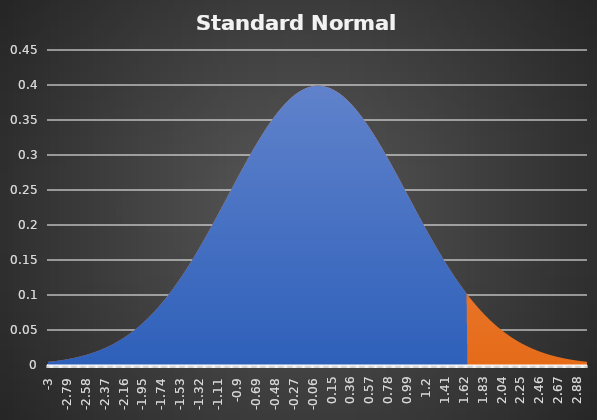
| Category | Z-Value | Area |
|---|---|---|
| -3.0 | 0.004 | 0.004 |
| -2.99 | 0.005 | 0.005 |
| -2.9800000000000004 | 0.005 | 0.005 |
| -2.9700000000000006 | 0.005 | 0.005 |
| -2.960000000000001 | 0.005 | 0.005 |
| -2.950000000000001 | 0.005 | 0.005 |
| -2.9400000000000013 | 0.005 | 0.005 |
| -2.9300000000000015 | 0.005 | 0.005 |
| -2.9200000000000017 | 0.006 | 0.006 |
| -2.910000000000002 | 0.006 | 0.006 |
| -2.900000000000002 | 0.006 | 0.006 |
| -2.8900000000000023 | 0.006 | 0.006 |
| -2.8800000000000026 | 0.006 | 0.006 |
| -2.8700000000000028 | 0.006 | 0.006 |
| -2.860000000000003 | 0.007 | 0.007 |
| -2.850000000000003 | 0.007 | 0.007 |
| -2.8400000000000034 | 0.007 | 0.007 |
| -2.8300000000000036 | 0.007 | 0.007 |
| -2.820000000000004 | 0.007 | 0.007 |
| -2.810000000000004 | 0.008 | 0.008 |
| -2.8000000000000043 | 0.008 | 0.008 |
| -2.7900000000000045 | 0.008 | 0.008 |
| -2.7800000000000047 | 0.008 | 0.008 |
| -2.770000000000005 | 0.009 | 0.009 |
| -2.760000000000005 | 0.009 | 0.009 |
| -2.7500000000000053 | 0.009 | 0.009 |
| -2.7400000000000055 | 0.009 | 0.009 |
| -2.7300000000000058 | 0.01 | 0.01 |
| -2.720000000000006 | 0.01 | 0.01 |
| -2.710000000000006 | 0.01 | 0.01 |
| -2.7000000000000064 | 0.01 | 0.01 |
| -2.6900000000000066 | 0.011 | 0.011 |
| -2.680000000000007 | 0.011 | 0.011 |
| -2.670000000000007 | 0.011 | 0.011 |
| -2.6600000000000072 | 0.012 | 0.012 |
| -2.6500000000000075 | 0.012 | 0.012 |
| -2.6400000000000077 | 0.012 | 0.012 |
| -2.630000000000008 | 0.013 | 0.013 |
| -2.620000000000008 | 0.013 | 0.013 |
| -2.6100000000000083 | 0.013 | 0.013 |
| -2.6000000000000085 | 0.014 | 0.014 |
| -2.5900000000000087 | 0.014 | 0.014 |
| -2.580000000000009 | 0.014 | 0.014 |
| -2.570000000000009 | 0.015 | 0.015 |
| -2.5600000000000094 | 0.015 | 0.015 |
| -2.5500000000000096 | 0.015 | 0.015 |
| -2.54000000000001 | 0.016 | 0.016 |
| -2.53000000000001 | 0.016 | 0.016 |
| -2.5200000000000102 | 0.017 | 0.017 |
| -2.5100000000000104 | 0.017 | 0.017 |
| -2.5000000000000107 | 0.018 | 0.018 |
| -2.490000000000011 | 0.018 | 0.018 |
| -2.480000000000011 | 0.018 | 0.018 |
| -2.4700000000000113 | 0.019 | 0.019 |
| -2.4600000000000115 | 0.019 | 0.019 |
| -2.4500000000000117 | 0.02 | 0.02 |
| -2.440000000000012 | 0.02 | 0.02 |
| -2.430000000000012 | 0.021 | 0.021 |
| -2.4200000000000124 | 0.021 | 0.021 |
| -2.4100000000000126 | 0.022 | 0.022 |
| -2.400000000000013 | 0.022 | 0.022 |
| -2.390000000000013 | 0.023 | 0.023 |
| -2.380000000000013 | 0.023 | 0.023 |
| -2.3700000000000134 | 0.024 | 0.024 |
| -2.3600000000000136 | 0.025 | 0.025 |
| -2.350000000000014 | 0.025 | 0.025 |
| -2.340000000000014 | 0.026 | 0.026 |
| -2.3300000000000143 | 0.026 | 0.026 |
| -2.3200000000000145 | 0.027 | 0.027 |
| -2.3100000000000147 | 0.028 | 0.028 |
| -2.300000000000015 | 0.028 | 0.028 |
| -2.290000000000015 | 0.029 | 0.029 |
| -2.2800000000000153 | 0.03 | 0.03 |
| -2.2700000000000156 | 0.03 | 0.03 |
| -2.2600000000000158 | 0.031 | 0.031 |
| -2.250000000000016 | 0.032 | 0.032 |
| -2.240000000000016 | 0.032 | 0.032 |
| -2.2300000000000164 | 0.033 | 0.033 |
| -2.2200000000000166 | 0.034 | 0.034 |
| -2.210000000000017 | 0.035 | 0.035 |
| -2.200000000000017 | 0.035 | 0.035 |
| -2.1900000000000173 | 0.036 | 0.036 |
| -2.1800000000000175 | 0.037 | 0.037 |
| -2.1700000000000177 | 0.038 | 0.038 |
| -2.160000000000018 | 0.039 | 0.039 |
| -2.150000000000018 | 0.04 | 0.04 |
| -2.1400000000000183 | 0.04 | 0.04 |
| -2.1300000000000185 | 0.041 | 0.041 |
| -2.1200000000000188 | 0.042 | 0.042 |
| -2.110000000000019 | 0.043 | 0.043 |
| -2.100000000000019 | 0.044 | 0.044 |
| -2.0900000000000194 | 0.045 | 0.045 |
| -2.0800000000000196 | 0.046 | 0.046 |
| -2.07000000000002 | 0.047 | 0.047 |
| -2.06000000000002 | 0.048 | 0.048 |
| -2.0500000000000203 | 0.049 | 0.049 |
| -2.0400000000000205 | 0.05 | 0.05 |
| -2.0300000000000207 | 0.051 | 0.051 |
| -2.020000000000021 | 0.052 | 0.052 |
| -2.010000000000021 | 0.053 | 0.053 |
| -2.0000000000000213 | 0.054 | 0.054 |
| -1.9900000000000213 | 0.055 | 0.055 |
| -1.9800000000000213 | 0.056 | 0.056 |
| -1.9700000000000213 | 0.057 | 0.057 |
| -1.9600000000000213 | 0.058 | 0.058 |
| -1.9500000000000213 | 0.06 | 0.06 |
| -1.9400000000000213 | 0.061 | 0.061 |
| -1.9300000000000213 | 0.062 | 0.062 |
| -1.9200000000000212 | 0.063 | 0.063 |
| -1.9100000000000212 | 0.064 | 0.064 |
| -1.9000000000000212 | 0.066 | 0.066 |
| -1.8900000000000212 | 0.067 | 0.067 |
| -1.8800000000000212 | 0.068 | 0.068 |
| -1.8700000000000212 | 0.069 | 0.069 |
| -1.8600000000000212 | 0.071 | 0.071 |
| -1.8500000000000212 | 0.072 | 0.072 |
| -1.8400000000000212 | 0.073 | 0.073 |
| -1.8300000000000212 | 0.075 | 0.075 |
| -1.8200000000000212 | 0.076 | 0.076 |
| -1.8100000000000211 | 0.078 | 0.078 |
| -1.8000000000000211 | 0.079 | 0.079 |
| -1.7900000000000211 | 0.08 | 0.08 |
| -1.7800000000000211 | 0.082 | 0.082 |
| -1.7700000000000211 | 0.083 | 0.083 |
| -1.760000000000021 | 0.085 | 0.085 |
| -1.750000000000021 | 0.086 | 0.086 |
| -1.740000000000021 | 0.088 | 0.088 |
| -1.730000000000021 | 0.089 | 0.089 |
| -1.720000000000021 | 0.091 | 0.091 |
| -1.710000000000021 | 0.092 | 0.092 |
| -1.700000000000021 | 0.094 | 0.094 |
| -1.690000000000021 | 0.096 | 0.096 |
| -1.680000000000021 | 0.097 | 0.097 |
| -1.670000000000021 | 0.099 | 0.099 |
| -1.660000000000021 | 0.101 | 0.101 |
| -1.650000000000021 | 0.102 | 0.102 |
| -1.640000000000021 | 0.104 | 0.104 |
| -1.630000000000021 | 0.106 | 0.106 |
| -1.620000000000021 | 0.107 | 0.107 |
| -1.610000000000021 | 0.109 | 0.109 |
| -1.600000000000021 | 0.111 | 0.111 |
| -1.590000000000021 | 0.113 | 0.113 |
| -1.580000000000021 | 0.115 | 0.115 |
| -1.570000000000021 | 0.116 | 0.116 |
| -1.560000000000021 | 0.118 | 0.118 |
| -1.550000000000021 | 0.12 | 0.12 |
| -1.540000000000021 | 0.122 | 0.122 |
| -1.530000000000021 | 0.124 | 0.124 |
| -1.520000000000021 | 0.126 | 0.126 |
| -1.5100000000000209 | 0.128 | 0.128 |
| -1.5000000000000209 | 0.13 | 0.13 |
| -1.4900000000000209 | 0.131 | 0.131 |
| -1.4800000000000209 | 0.133 | 0.133 |
| -1.4700000000000208 | 0.135 | 0.135 |
| -1.4600000000000208 | 0.137 | 0.137 |
| -1.4500000000000208 | 0.139 | 0.139 |
| -1.4400000000000208 | 0.141 | 0.141 |
| -1.4300000000000208 | 0.144 | 0.144 |
| -1.4200000000000208 | 0.146 | 0.146 |
| -1.4100000000000208 | 0.148 | 0.148 |
| -1.4000000000000208 | 0.15 | 0.15 |
| -1.3900000000000208 | 0.152 | 0.152 |
| -1.3800000000000208 | 0.154 | 0.154 |
| -1.3700000000000208 | 0.156 | 0.156 |
| -1.3600000000000207 | 0.158 | 0.158 |
| -1.3500000000000207 | 0.16 | 0.16 |
| -1.3400000000000207 | 0.163 | 0.163 |
| -1.3300000000000207 | 0.165 | 0.165 |
| -1.3200000000000207 | 0.167 | 0.167 |
| -1.3100000000000207 | 0.169 | 0.169 |
| -1.3000000000000207 | 0.171 | 0.171 |
| -1.2900000000000207 | 0.174 | 0.174 |
| -1.2800000000000207 | 0.176 | 0.176 |
| -1.2700000000000207 | 0.178 | 0.178 |
| -1.2600000000000207 | 0.18 | 0.18 |
| -1.2500000000000207 | 0.183 | 0.183 |
| -1.2400000000000206 | 0.185 | 0.185 |
| -1.2300000000000206 | 0.187 | 0.187 |
| -1.2200000000000206 | 0.19 | 0.19 |
| -1.2100000000000206 | 0.192 | 0.192 |
| -1.2000000000000206 | 0.194 | 0.194 |
| -1.1900000000000206 | 0.197 | 0.197 |
| -1.1800000000000206 | 0.199 | 0.199 |
| -1.1700000000000206 | 0.201 | 0.201 |
| -1.1600000000000206 | 0.204 | 0.204 |
| -1.1500000000000206 | 0.206 | 0.206 |
| -1.1400000000000206 | 0.208 | 0.208 |
| -1.1300000000000205 | 0.211 | 0.211 |
| -1.1200000000000205 | 0.213 | 0.213 |
| -1.1100000000000205 | 0.215 | 0.215 |
| -1.1000000000000205 | 0.218 | 0.218 |
| -1.0900000000000205 | 0.22 | 0.22 |
| -1.0800000000000205 | 0.223 | 0.223 |
| -1.0700000000000205 | 0.225 | 0.225 |
| -1.0600000000000205 | 0.227 | 0.227 |
| -1.0500000000000205 | 0.23 | 0.23 |
| -1.0400000000000205 | 0.232 | 0.232 |
| -1.0300000000000205 | 0.235 | 0.235 |
| -1.0200000000000204 | 0.237 | 0.237 |
| -1.0100000000000204 | 0.24 | 0.24 |
| -1.0000000000000204 | 0.242 | 0.242 |
| -0.9900000000000204 | 0.244 | 0.244 |
| -0.9800000000000204 | 0.247 | 0.247 |
| -0.9700000000000204 | 0.249 | 0.249 |
| -0.9600000000000204 | 0.252 | 0.252 |
| -0.9500000000000204 | 0.254 | 0.254 |
| -0.9400000000000204 | 0.256 | 0.256 |
| -0.9300000000000204 | 0.259 | 0.259 |
| -0.9200000000000204 | 0.261 | 0.261 |
| -0.9100000000000203 | 0.264 | 0.264 |
| -0.9000000000000203 | 0.266 | 0.266 |
| -0.8900000000000203 | 0.268 | 0.268 |
| -0.8800000000000203 | 0.271 | 0.271 |
| -0.8700000000000203 | 0.273 | 0.273 |
| -0.8600000000000203 | 0.276 | 0.276 |
| -0.8500000000000203 | 0.278 | 0.278 |
| -0.8400000000000203 | 0.28 | 0.28 |
| -0.8300000000000203 | 0.283 | 0.283 |
| -0.8200000000000203 | 0.285 | 0.285 |
| -0.8100000000000203 | 0.287 | 0.287 |
| -0.8000000000000203 | 0.29 | 0.29 |
| -0.7900000000000202 | 0.292 | 0.292 |
| -0.7800000000000202 | 0.294 | 0.294 |
| -0.7700000000000202 | 0.297 | 0.297 |
| -0.7600000000000202 | 0.299 | 0.299 |
| -0.7500000000000202 | 0.301 | 0.301 |
| -0.7400000000000202 | 0.303 | 0.303 |
| -0.7300000000000202 | 0.306 | 0.306 |
| -0.7200000000000202 | 0.308 | 0.308 |
| -0.7100000000000202 | 0.31 | 0.31 |
| -0.7000000000000202 | 0.312 | 0.312 |
| -0.6900000000000202 | 0.314 | 0.314 |
| -0.6800000000000201 | 0.317 | 0.317 |
| -0.6700000000000201 | 0.319 | 0.319 |
| -0.6600000000000201 | 0.321 | 0.321 |
| -0.6500000000000201 | 0.323 | 0.323 |
| -0.6400000000000201 | 0.325 | 0.325 |
| -0.6300000000000201 | 0.327 | 0.327 |
| -0.6200000000000201 | 0.329 | 0.329 |
| -0.6100000000000201 | 0.331 | 0.331 |
| -0.6000000000000201 | 0.333 | 0.333 |
| -0.5900000000000201 | 0.335 | 0.335 |
| -0.58000000000002 | 0.337 | 0.337 |
| -0.57000000000002 | 0.339 | 0.339 |
| -0.56000000000002 | 0.341 | 0.341 |
| -0.55000000000002 | 0.343 | 0.343 |
| -0.54000000000002 | 0.345 | 0.345 |
| -0.53000000000002 | 0.347 | 0.347 |
| -0.52000000000002 | 0.348 | 0.348 |
| -0.51000000000002 | 0.35 | 0.35 |
| -0.50000000000002 | 0.352 | 0.352 |
| -0.49000000000002 | 0.354 | 0.354 |
| -0.48000000000001997 | 0.356 | 0.356 |
| -0.47000000000001996 | 0.357 | 0.357 |
| -0.46000000000001995 | 0.359 | 0.359 |
| -0.45000000000001994 | 0.361 | 0.361 |
| -0.44000000000001993 | 0.362 | 0.362 |
| -0.4300000000000199 | 0.364 | 0.364 |
| -0.4200000000000199 | 0.365 | 0.365 |
| -0.4100000000000199 | 0.367 | 0.367 |
| -0.4000000000000199 | 0.368 | 0.368 |
| -0.3900000000000199 | 0.37 | 0.37 |
| -0.3800000000000199 | 0.371 | 0.371 |
| -0.37000000000001987 | 0.373 | 0.373 |
| -0.36000000000001986 | 0.374 | 0.374 |
| -0.35000000000001985 | 0.375 | 0.375 |
| -0.34000000000001984 | 0.377 | 0.377 |
| -0.33000000000001983 | 0.378 | 0.378 |
| -0.3200000000000198 | 0.379 | 0.379 |
| -0.3100000000000198 | 0.38 | 0.38 |
| -0.3000000000000198 | 0.381 | 0.381 |
| -0.2900000000000198 | 0.383 | 0.383 |
| -0.2800000000000198 | 0.384 | 0.384 |
| -0.2700000000000198 | 0.385 | 0.385 |
| -0.26000000000001977 | 0.386 | 0.386 |
| -0.25000000000001976 | 0.387 | 0.387 |
| -0.24000000000001975 | 0.388 | 0.388 |
| -0.23000000000001974 | 0.389 | 0.389 |
| -0.22000000000001974 | 0.389 | 0.389 |
| -0.21000000000001973 | 0.39 | 0.39 |
| -0.20000000000001972 | 0.391 | 0.391 |
| -0.1900000000000197 | 0.392 | 0.392 |
| -0.1800000000000197 | 0.393 | 0.393 |
| -0.1700000000000197 | 0.393 | 0.393 |
| -0.16000000000001968 | 0.394 | 0.394 |
| -0.15000000000001967 | 0.394 | 0.394 |
| -0.14000000000001966 | 0.395 | 0.395 |
| -0.13000000000001966 | 0.396 | 0.396 |
| -0.12000000000001966 | 0.396 | 0.396 |
| -0.11000000000001967 | 0.397 | 0.397 |
| -0.10000000000001967 | 0.397 | 0.397 |
| -0.09000000000001968 | 0.397 | 0.397 |
| -0.08000000000001968 | 0.398 | 0.398 |
| -0.07000000000001969 | 0.398 | 0.398 |
| -0.06000000000001968 | 0.398 | 0.398 |
| -0.05000000000001968 | 0.398 | 0.398 |
| -0.04000000000001968 | 0.399 | 0.399 |
| -0.030000000000019678 | 0.399 | 0.399 |
| -0.020000000000019676 | 0.399 | 0.399 |
| -0.010000000000019675 | 0.399 | 0.399 |
| 0.0 | 0.399 | 0.399 |
| 0.01 | 0.399 | 0.399 |
| 0.02 | 0.399 | 0.399 |
| 0.03 | 0.399 | 0.399 |
| 0.04 | 0.399 | 0.399 |
| 0.05 | 0.398 | 0.398 |
| 0.060000000000000005 | 0.398 | 0.398 |
| 0.07 | 0.398 | 0.398 |
| 0.08 | 0.398 | 0.398 |
| 0.09 | 0.397 | 0.397 |
| 0.09999999999999999 | 0.397 | 0.397 |
| 0.10999999999999999 | 0.397 | 0.397 |
| 0.11999999999999998 | 0.396 | 0.396 |
| 0.12999999999999998 | 0.396 | 0.396 |
| 0.13999999999999999 | 0.395 | 0.395 |
| 0.15 | 0.394 | 0.394 |
| 0.16 | 0.394 | 0.394 |
| 0.17 | 0.393 | 0.393 |
| 0.18000000000000002 | 0.393 | 0.393 |
| 0.19000000000000003 | 0.392 | 0.392 |
| 0.20000000000000004 | 0.391 | 0.391 |
| 0.21000000000000005 | 0.39 | 0.39 |
| 0.22000000000000006 | 0.389 | 0.389 |
| 0.23000000000000007 | 0.389 | 0.389 |
| 0.24000000000000007 | 0.388 | 0.388 |
| 0.25000000000000006 | 0.387 | 0.387 |
| 0.26000000000000006 | 0.386 | 0.386 |
| 0.2700000000000001 | 0.385 | 0.385 |
| 0.2800000000000001 | 0.384 | 0.384 |
| 0.2900000000000001 | 0.383 | 0.383 |
| 0.3000000000000001 | 0.381 | 0.381 |
| 0.3100000000000001 | 0.38 | 0.38 |
| 0.3200000000000001 | 0.379 | 0.379 |
| 0.3300000000000001 | 0.378 | 0.378 |
| 0.34000000000000014 | 0.377 | 0.377 |
| 0.35000000000000014 | 0.375 | 0.375 |
| 0.36000000000000015 | 0.374 | 0.374 |
| 0.37000000000000016 | 0.373 | 0.373 |
| 0.38000000000000017 | 0.371 | 0.371 |
| 0.3900000000000002 | 0.37 | 0.37 |
| 0.4000000000000002 | 0.368 | 0.368 |
| 0.4100000000000002 | 0.367 | 0.367 |
| 0.4200000000000002 | 0.365 | 0.365 |
| 0.4300000000000002 | 0.364 | 0.364 |
| 0.4400000000000002 | 0.362 | 0.362 |
| 0.45000000000000023 | 0.361 | 0.361 |
| 0.46000000000000024 | 0.359 | 0.359 |
| 0.47000000000000025 | 0.357 | 0.357 |
| 0.48000000000000026 | 0.356 | 0.356 |
| 0.49000000000000027 | 0.354 | 0.354 |
| 0.5000000000000002 | 0.352 | 0.352 |
| 0.5100000000000002 | 0.35 | 0.35 |
| 0.5200000000000002 | 0.348 | 0.348 |
| 0.5300000000000002 | 0.347 | 0.347 |
| 0.5400000000000003 | 0.345 | 0.345 |
| 0.5500000000000003 | 0.343 | 0.343 |
| 0.5600000000000003 | 0.341 | 0.341 |
| 0.5700000000000003 | 0.339 | 0.339 |
| 0.5800000000000003 | 0.337 | 0.337 |
| 0.5900000000000003 | 0.335 | 0.335 |
| 0.6000000000000003 | 0.333 | 0.333 |
| 0.6100000000000003 | 0.331 | 0.331 |
| 0.6200000000000003 | 0.329 | 0.329 |
| 0.6300000000000003 | 0.327 | 0.327 |
| 0.6400000000000003 | 0.325 | 0.325 |
| 0.6500000000000004 | 0.323 | 0.323 |
| 0.6600000000000004 | 0.321 | 0.321 |
| 0.6700000000000004 | 0.319 | 0.319 |
| 0.6800000000000004 | 0.317 | 0.317 |
| 0.6900000000000004 | 0.314 | 0.314 |
| 0.7000000000000004 | 0.312 | 0.312 |
| 0.7100000000000004 | 0.31 | 0.31 |
| 0.7200000000000004 | 0.308 | 0.308 |
| 0.7300000000000004 | 0.306 | 0.306 |
| 0.7400000000000004 | 0.303 | 0.303 |
| 0.7500000000000004 | 0.301 | 0.301 |
| 0.7600000000000005 | 0.299 | 0.299 |
| 0.7700000000000005 | 0.297 | 0.297 |
| 0.7800000000000005 | 0.294 | 0.294 |
| 0.7900000000000005 | 0.292 | 0.292 |
| 0.8000000000000005 | 0.29 | 0.29 |
| 0.8100000000000005 | 0.287 | 0.287 |
| 0.8200000000000005 | 0.285 | 0.285 |
| 0.8300000000000005 | 0.283 | 0.283 |
| 0.8400000000000005 | 0.28 | 0.28 |
| 0.8500000000000005 | 0.278 | 0.278 |
| 0.8600000000000005 | 0.276 | 0.276 |
| 0.8700000000000006 | 0.273 | 0.273 |
| 0.8800000000000006 | 0.271 | 0.271 |
| 0.8900000000000006 | 0.268 | 0.268 |
| 0.9000000000000006 | 0.266 | 0.266 |
| 0.9100000000000006 | 0.264 | 0.264 |
| 0.9200000000000006 | 0.261 | 0.261 |
| 0.9300000000000006 | 0.259 | 0.259 |
| 0.9400000000000006 | 0.256 | 0.256 |
| 0.9500000000000006 | 0.254 | 0.254 |
| 0.9600000000000006 | 0.252 | 0.252 |
| 0.9700000000000006 | 0.249 | 0.249 |
| 0.9800000000000006 | 0.247 | 0.247 |
| 0.9900000000000007 | 0.244 | 0.244 |
| 1.0000000000000007 | 0.242 | 0.242 |
| 1.0100000000000007 | 0.24 | 0.24 |
| 1.0200000000000007 | 0.237 | 0.237 |
| 1.0300000000000007 | 0.235 | 0.235 |
| 1.0400000000000007 | 0.232 | 0.232 |
| 1.0500000000000007 | 0.23 | 0.23 |
| 1.0600000000000007 | 0.227 | 0.227 |
| 1.0700000000000007 | 0.225 | 0.225 |
| 1.0800000000000007 | 0.223 | 0.223 |
| 1.0900000000000007 | 0.22 | 0.22 |
| 1.1000000000000008 | 0.218 | 0.218 |
| 1.1100000000000008 | 0.215 | 0.215 |
| 1.1200000000000008 | 0.213 | 0.213 |
| 1.1300000000000008 | 0.211 | 0.211 |
| 1.1400000000000008 | 0.208 | 0.208 |
| 1.1500000000000008 | 0.206 | 0.206 |
| 1.1600000000000008 | 0.204 | 0.204 |
| 1.1700000000000008 | 0.201 | 0.201 |
| 1.1800000000000008 | 0.199 | 0.199 |
| 1.1900000000000008 | 0.197 | 0.197 |
| 1.2000000000000008 | 0.194 | 0.194 |
| 1.2100000000000009 | 0.192 | 0.192 |
| 1.2200000000000009 | 0.19 | 0.19 |
| 1.2300000000000009 | 0.187 | 0.187 |
| 1.2400000000000009 | 0.185 | 0.185 |
| 1.2500000000000009 | 0.183 | 0.183 |
| 1.260000000000001 | 0.18 | 0.18 |
| 1.270000000000001 | 0.178 | 0.178 |
| 1.280000000000001 | 0.176 | 0.176 |
| 1.290000000000001 | 0.174 | 0.174 |
| 1.300000000000001 | 0.171 | 0.171 |
| 1.310000000000001 | 0.169 | 0.169 |
| 1.320000000000001 | 0.167 | 0.167 |
| 1.330000000000001 | 0.165 | 0.165 |
| 1.340000000000001 | 0.163 | 0.163 |
| 1.350000000000001 | 0.16 | 0.16 |
| 1.360000000000001 | 0.158 | 0.158 |
| 1.370000000000001 | 0.156 | 0.156 |
| 1.380000000000001 | 0.154 | 0.154 |
| 1.390000000000001 | 0.152 | 0.152 |
| 1.400000000000001 | 0.15 | 0.15 |
| 1.410000000000001 | 0.148 | 0.148 |
| 1.420000000000001 | 0.146 | 0.146 |
| 1.430000000000001 | 0.144 | 0.144 |
| 1.440000000000001 | 0.141 | 0.141 |
| 1.450000000000001 | 0.139 | 0.139 |
| 1.460000000000001 | 0.137 | 0.137 |
| 1.470000000000001 | 0.135 | 0.135 |
| 1.480000000000001 | 0.133 | 0.133 |
| 1.490000000000001 | 0.131 | 0.131 |
| 1.500000000000001 | 0.13 | 0.13 |
| 1.5100000000000011 | 0.128 | 0.128 |
| 1.5200000000000011 | 0.126 | 0.126 |
| 1.5300000000000011 | 0.124 | 0.124 |
| 1.5400000000000011 | 0.122 | 0.122 |
| 1.5500000000000012 | 0.12 | 0.12 |
| 1.5600000000000012 | 0.118 | 0.118 |
| 1.5700000000000012 | 0.116 | 0.116 |
| 1.5800000000000012 | 0.115 | 0.115 |
| 1.5900000000000012 | 0.113 | 0.113 |
| 1.6000000000000012 | 0.111 | 0.111 |
| 1.6100000000000012 | 0.109 | 0.109 |
| 1.6200000000000012 | 0.107 | 0.107 |
| 1.6300000000000012 | 0.106 | 0.106 |
| 1.6400000000000012 | 0.104 | 0.104 |
| 1.6500000000000012 | 0.102 | 0.102 |
| 1.6600000000000013 | 0.101 | 0 |
| 1.6700000000000013 | 0.099 | 0 |
| 1.6800000000000013 | 0.097 | 0 |
| 1.6900000000000013 | 0.096 | 0 |
| 1.7000000000000013 | 0.094 | 0 |
| 1.7100000000000013 | 0.092 | 0 |
| 1.7200000000000013 | 0.091 | 0 |
| 1.7300000000000013 | 0.089 | 0 |
| 1.7400000000000013 | 0.088 | 0 |
| 1.7500000000000013 | 0.086 | 0 |
| 1.7600000000000013 | 0.085 | 0 |
| 1.7700000000000014 | 0.083 | 0 |
| 1.7800000000000014 | 0.082 | 0 |
| 1.7900000000000014 | 0.08 | 0 |
| 1.8000000000000014 | 0.079 | 0 |
| 1.8100000000000014 | 0.078 | 0 |
| 1.8200000000000014 | 0.076 | 0 |
| 1.8300000000000014 | 0.075 | 0 |
| 1.8400000000000014 | 0.073 | 0 |
| 1.8500000000000014 | 0.072 | 0 |
| 1.8600000000000014 | 0.071 | 0 |
| 1.8700000000000014 | 0.069 | 0 |
| 1.8800000000000014 | 0.068 | 0 |
| 1.8900000000000015 | 0.067 | 0 |
| 1.9000000000000015 | 0.066 | 0 |
| 1.9100000000000015 | 0.064 | 0 |
| 1.9200000000000015 | 0.063 | 0 |
| 1.9300000000000015 | 0.062 | 0 |
| 1.9400000000000015 | 0.061 | 0 |
| 1.9500000000000015 | 0.06 | 0 |
| 1.9600000000000015 | 0.058 | 0 |
| 1.9700000000000015 | 0.057 | 0 |
| 1.9800000000000015 | 0.056 | 0 |
| 1.9900000000000015 | 0.055 | 0 |
| 2.0000000000000013 | 0.054 | 0 |
| 2.010000000000001 | 0.053 | 0 |
| 2.020000000000001 | 0.052 | 0 |
| 2.0300000000000007 | 0.051 | 0 |
| 2.0400000000000005 | 0.05 | 0 |
| 2.0500000000000003 | 0.049 | 0 |
| 2.06 | 0.048 | 0 |
| 2.07 | 0.047 | 0 |
| 2.0799999999999996 | 0.046 | 0 |
| 2.0899999999999994 | 0.045 | 0 |
| 2.099999999999999 | 0.044 | 0 |
| 2.109999999999999 | 0.043 | 0 |
| 2.1199999999999988 | 0.042 | 0 |
| 2.1299999999999986 | 0.041 | 0 |
| 2.1399999999999983 | 0.04 | 0 |
| 2.149999999999998 | 0.04 | 0 |
| 2.159999999999998 | 0.039 | 0 |
| 2.1699999999999977 | 0.038 | 0 |
| 2.1799999999999975 | 0.037 | 0 |
| 2.1899999999999973 | 0.036 | 0 |
| 2.199999999999997 | 0.035 | 0 |
| 2.209999999999997 | 0.035 | 0 |
| 2.2199999999999966 | 0.034 | 0 |
| 2.2299999999999964 | 0.033 | 0 |
| 2.239999999999996 | 0.032 | 0 |
| 2.249999999999996 | 0.032 | 0 |
| 2.259999999999996 | 0.031 | 0 |
| 2.2699999999999956 | 0.03 | 0 |
| 2.2799999999999954 | 0.03 | 0 |
| 2.289999999999995 | 0.029 | 0 |
| 2.299999999999995 | 0.028 | 0 |
| 2.3099999999999947 | 0.028 | 0 |
| 2.3199999999999945 | 0.027 | 0 |
| 2.3299999999999943 | 0.026 | 0 |
| 2.339999999999994 | 0.026 | 0 |
| 2.349999999999994 | 0.025 | 0 |
| 2.3599999999999937 | 0.025 | 0 |
| 2.3699999999999934 | 0.024 | 0 |
| 2.3799999999999932 | 0.023 | 0 |
| 2.389999999999993 | 0.023 | 0 |
| 2.399999999999993 | 0.022 | 0 |
| 2.4099999999999926 | 0.022 | 0 |
| 2.4199999999999924 | 0.021 | 0 |
| 2.429999999999992 | 0.021 | 0 |
| 2.439999999999992 | 0.02 | 0 |
| 2.4499999999999917 | 0.02 | 0 |
| 2.4599999999999915 | 0.019 | 0 |
| 2.4699999999999913 | 0.019 | 0 |
| 2.479999999999991 | 0.018 | 0 |
| 2.489999999999991 | 0.018 | 0 |
| 2.4999999999999907 | 0.018 | 0 |
| 2.5099999999999905 | 0.017 | 0 |
| 2.5199999999999902 | 0.017 | 0 |
| 2.52999999999999 | 0.016 | 0 |
| 2.53999999999999 | 0.016 | 0 |
| 2.5499999999999896 | 0.015 | 0 |
| 2.5599999999999894 | 0.015 | 0 |
| 2.569999999999989 | 0.015 | 0 |
| 2.579999999999989 | 0.014 | 0 |
| 2.5899999999999888 | 0.014 | 0 |
| 2.5999999999999885 | 0.014 | 0 |
| 2.6099999999999883 | 0.013 | 0 |
| 2.619999999999988 | 0.013 | 0 |
| 2.629999999999988 | 0.013 | 0 |
| 2.6399999999999877 | 0.012 | 0 |
| 2.6499999999999875 | 0.012 | 0 |
| 2.6599999999999873 | 0.012 | 0 |
| 2.669999999999987 | 0.011 | 0 |
| 2.679999999999987 | 0.011 | 0 |
| 2.6899999999999866 | 0.011 | 0 |
| 2.6999999999999864 | 0.01 | 0 |
| 2.709999999999986 | 0.01 | 0 |
| 2.719999999999986 | 0.01 | 0 |
| 2.7299999999999858 | 0.01 | 0 |
| 2.7399999999999856 | 0.009 | 0 |
| 2.7499999999999853 | 0.009 | 0 |
| 2.759999999999985 | 0.009 | 0 |
| 2.769999999999985 | 0.009 | 0 |
| 2.7799999999999847 | 0.008 | 0 |
| 2.7899999999999845 | 0.008 | 0 |
| 2.7999999999999843 | 0.008 | 0 |
| 2.809999999999984 | 0.008 | 0 |
| 2.819999999999984 | 0.007 | 0 |
| 2.8299999999999836 | 0.007 | 0 |
| 2.8399999999999834 | 0.007 | 0 |
| 2.849999999999983 | 0.007 | 0 |
| 2.859999999999983 | 0.007 | 0 |
| 2.869999999999983 | 0.006 | 0 |
| 2.8799999999999826 | 0.006 | 0 |
| 2.8899999999999824 | 0.006 | 0 |
| 2.899999999999982 | 0.006 | 0 |
| 2.909999999999982 | 0.006 | 0 |
| 2.9199999999999817 | 0.006 | 0 |
| 2.9299999999999815 | 0.005 | 0 |
| 2.9399999999999813 | 0.005 | 0 |
| 2.949999999999981 | 0.005 | 0 |
| 2.959999999999981 | 0.005 | 0 |
| 2.9699999999999807 | 0.005 | 0 |
| 2.9799999999999804 | 0.005 | 0 |
| 2.9899999999999802 | 0.005 | 0 |
| 2.99999999999998 | 0.004 | 0 |